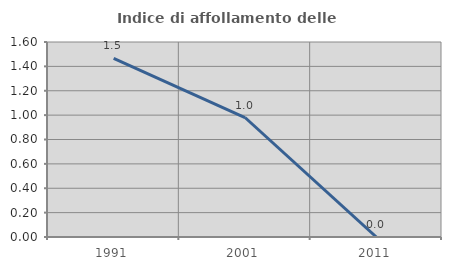
| Category | Indice di affollamento delle abitazioni  |
|---|---|
| 1991.0 | 1.466 |
| 2001.0 | 0.98 |
| 2011.0 | 0 |